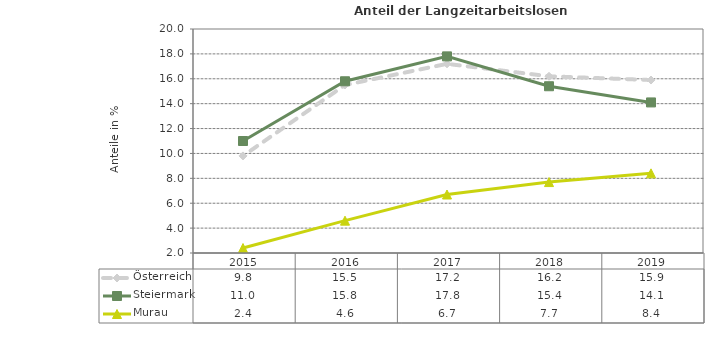
| Category | Österreich | Steiermark | Murau |
|---|---|---|---|
| 2019.0 | 15.9 | 14.1 | 8.4 |
| 2018.0 | 16.2 | 15.4 | 7.7 |
| 2017.0 | 17.2 | 17.8 | 6.7 |
| 2016.0 | 15.5 | 15.8 | 4.6 |
| 2015.0 | 9.8 | 11 | 2.4 |